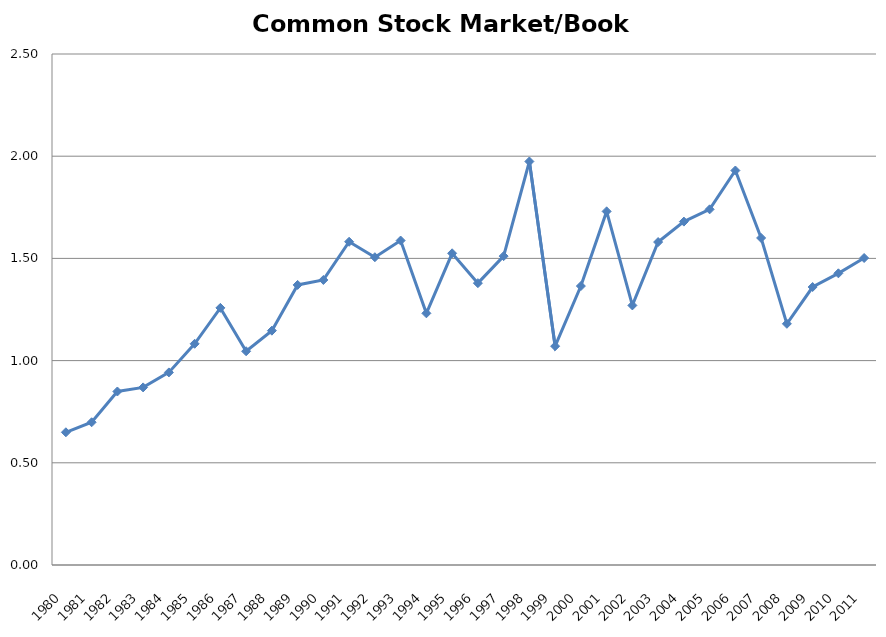
| Category | Series 0 |
|---|---|
| 1980.0 | 0.649 |
| 1981.0 | 0.698 |
| 1982.0 | 0.849 |
| 1983.0 | 0.869 |
| 1984.0 | 0.942 |
| 1985.0 | 1.082 |
| 1986.0 | 1.258 |
| 1987.0 | 1.046 |
| 1988.0 | 1.147 |
| 1989.0 | 1.37 |
| 1990.0 | 1.395 |
| 1991.0 | 1.581 |
| 1992.0 | 1.506 |
| 1993.0 | 1.587 |
| 1994.0 | 1.231 |
| 1995.0 | 1.525 |
| 1996.0 | 1.379 |
| 1997.0 | 1.511 |
| 1998.0 | 1.974 |
| 1999.0 | 1.071 |
| 2000.0 | 1.365 |
| 2001.0 | 1.73 |
| 2002.0 | 1.27 |
| 2003.0 | 1.58 |
| 2004.0 | 1.68 |
| 2005.0 | 1.74 |
| 2006.0 | 1.93 |
| 2007.0 | 1.6 |
| 2008.0 | 1.18 |
| 2009.0 | 1.36 |
| 2010.0 | 1.427 |
| 2011.0 | 1.502 |